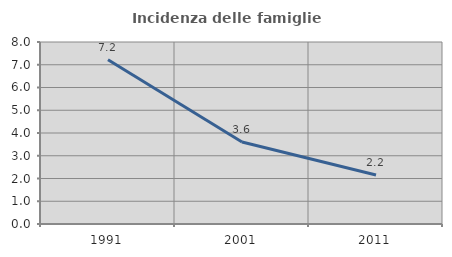
| Category | Incidenza delle famiglie numerose |
|---|---|
| 1991.0 | 7.22 |
| 2001.0 | 3.604 |
| 2011.0 | 2.154 |